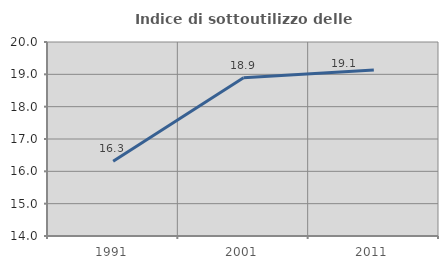
| Category | Indice di sottoutilizzo delle abitazioni  |
|---|---|
| 1991.0 | 16.312 |
| 2001.0 | 18.898 |
| 2011.0 | 19.13 |